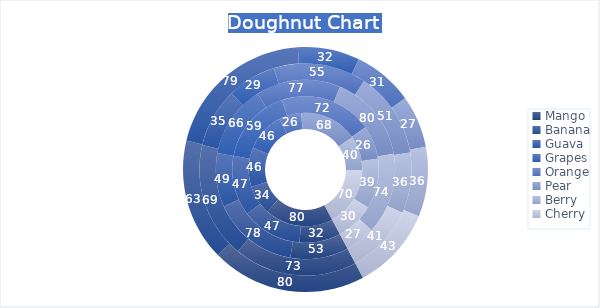
| Category | Ann St | 145 St Street | Arden St | Alen St | Bridge St |
|---|---|---|---|---|---|
| Mango | 80 | 32 | 53 | 73 | 80 |
| Banana | 34 | 47 | 78 | 69 | 63 |
| Guava | 46 | 47 | 49 | 35 | 79 |
| Grapes | 46 | 59 | 66 | 29 | 32 |
| Orange | 26 | 72 | 77 | 55 | 31 |
| Pear | 68 | 26 | 80 | 51 | 27 |
| Berry | 40 | 39 | 74 | 36 | 36 |
| Cherry | 70 | 30 | 27 | 41 | 43 |